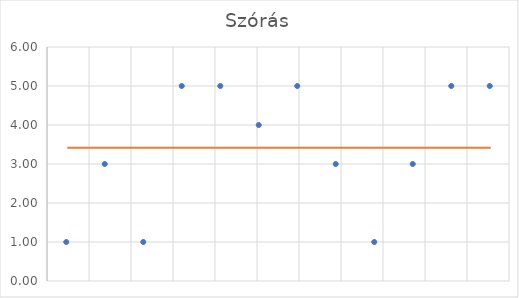
| Category | átlag |
|---|---|
| 0 | 3.417 |
| 1 | 3.417 |
| 2 | 3.417 |
| 3 | 3.417 |
| 4 | 3.417 |
| 5 | 3.417 |
| 6 | 3.417 |
| 7 | 3.417 |
| 8 | 3.417 |
| 9 | 3.417 |
| 10 | 3.417 |
| 11 | 3.417 |